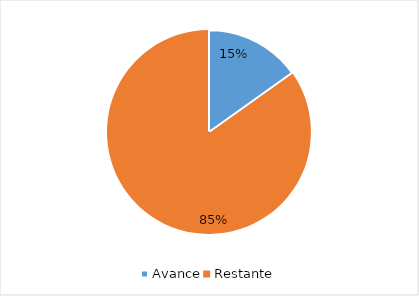
| Category | Series 0 |
|---|---|
| Avance | 0.152 |
| Restante | 0.848 |